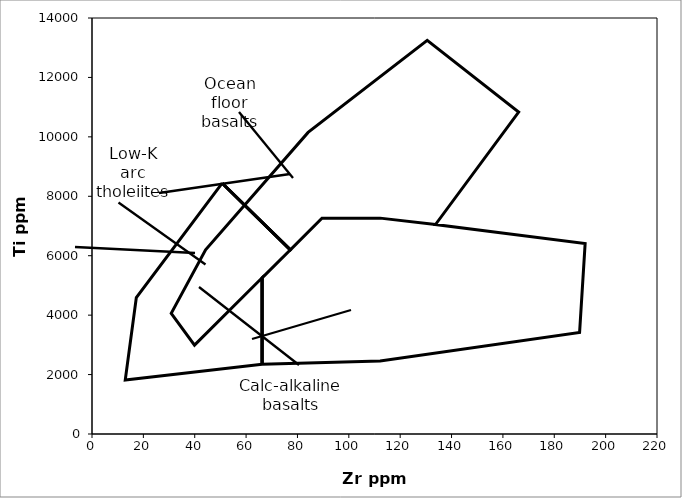
| Category | Series 0 |
|---|---|
| 50.70118662351672 | 8440.171 |
| 17.25997842502697 | 4594.017 |
| 12.944983818770226 | 1816.239 |
| 66.23516720604098 | 2350.427 |
| 112.1898597626753 | 2457.265 |
| 189.85976267529665 | 3418.803 |
| 192.01725997842502 | 6410.256 |
| 133.76483279395902 | 7051.282 |
| 166.12729234088457 | 10833.333 |
| 130.52858683926644 | 13247.863 |
| 84.14239482200647 | 10149.573 |
| 44.228694714131606 | 6196.581 |
| 30.852211434735707 | 4059.829 |
| 39.91370010787487 | 2991.453 |
| 66.23516720604098 | 5256.41 |
| 66.23516720604098 | 2350.427 |
| 66.23516720604098 | 5256.41 |
| 77.23840345199568 | 6196.581 |
| 50.70118662351672 | 8440.171 |
| 77.23840345199568 | 6196.581 |
| 89.5361380798274 | 7264.957 |
| 112.1898597626753 | 7264.957 |
| 133.76483279395902 | 7051.282 |